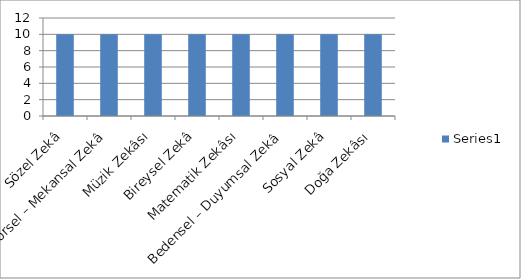
| Category | Series 0 |
|---|---|
| Sözel Zekâ | 10 |
| Görsel – Mekansal Zekâ | 10 |
| Müzik Zekâsı | 10 |
| Bireysel Zekâ | 10 |
| Matematik Zekâsı | 10 |
| Bedensel – Duyumsal Zekâ | 10 |
| Sosyal Zekâ | 10 |
| Doğa Zekâsı | 10 |